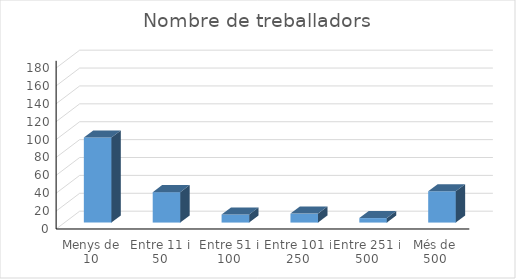
| Category | Series 0 |
|---|---|
| Menys de 10 | 95 |
| Entre 11 i 50 | 34 |
| Entre 51 i 100 | 9 |
| Entre 101 i 250 | 10 |
| Entre 251 i 500 | 5 |
| Més de 500 | 35 |